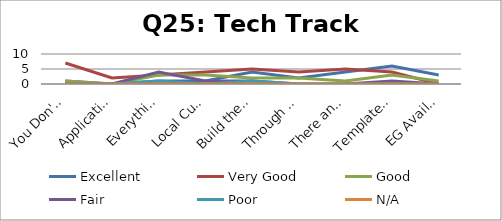
| Category | Excellent | Very Good | Good | Fair | Poor | N/A |
|---|---|---|---|---|---|---|
| You Don't Have to be a Mechanic | 1 | 7 | 1 | 0 | 0 | 0 |
| Application Development | 0 | 2 | 0 | 0 | 0 | 0 |
| Everything a SysAdmin | 1 | 3 | 3 | 4 | 1 | 0 |
| Local Customizations | 1 | 4 | 3 | 1 | 0 | 0 |
| Build the OPAC of your Dreams | 4 | 5 | 2 | 1 | 1 | 0 |
| Through the Looking Glass (Part 2) | 2 | 4 | 2 | 0 | 0 | 0 |
| There and Back Again | 4 | 5 | 1 | 0 | 0 | 0 |
| Template Toolkit OPAC  | 6 | 4 | 3 | 1 | 0 | 0 |
| EG Availability Monitoring | 3 | 0 | 1 | 0 | 0 | 0 |